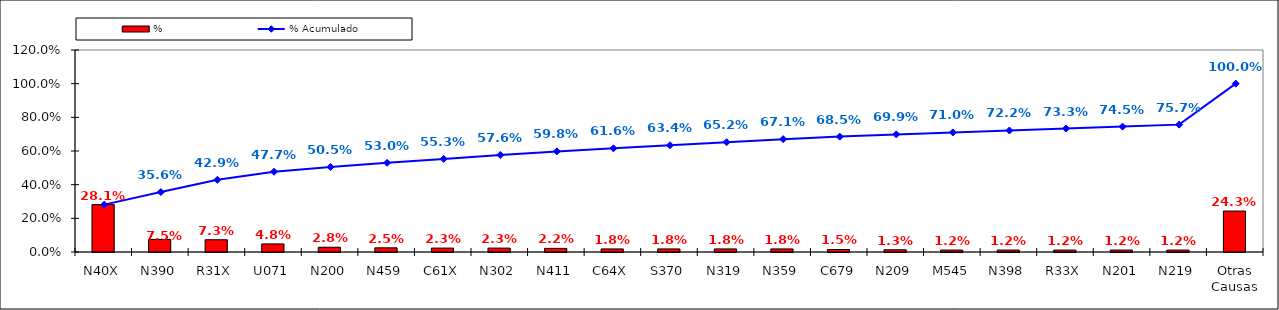
| Category | % |
|---|---|
| N40X | 0.281 |
| N390 | 0.075 |
| R31X | 0.073 |
| U071 | 0.048 |
| N200 | 0.028 |
| N459 | 0.025 |
| C61X | 0.023 |
| N302 | 0.023 |
| N411 | 0.022 |
| C64X | 0.018 |
| S370 | 0.018 |
| N319 | 0.018 |
| N359 | 0.018 |
| C679 | 0.015 |
| N209 | 0.013 |
| M545 | 0.012 |
| N398 | 0.012 |
| R33X | 0.012 |
| N201 | 0.012 |
| N219 | 0.012 |
| Otras Causas | 0.243 |